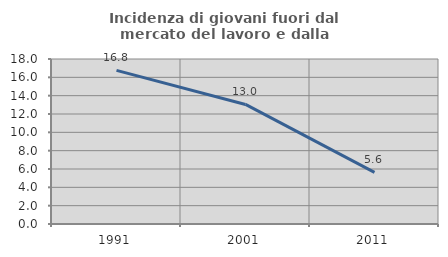
| Category | Incidenza di giovani fuori dal mercato del lavoro e dalla formazione  |
|---|---|
| 1991.0 | 16.763 |
| 2001.0 | 13.043 |
| 2011.0 | 5.625 |